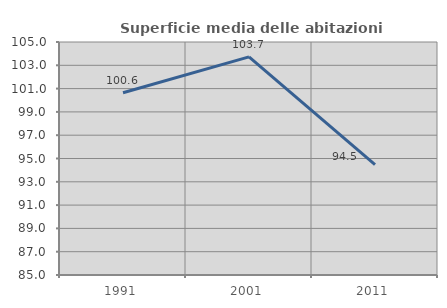
| Category | Superficie media delle abitazioni occupate |
|---|---|
| 1991.0 | 100.642 |
| 2001.0 | 103.721 |
| 2011.0 | 94.478 |